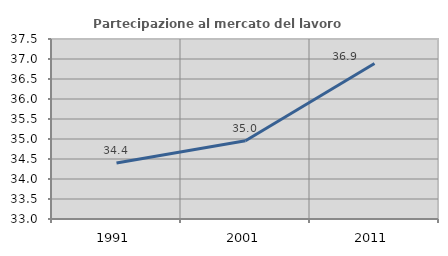
| Category | Partecipazione al mercato del lavoro  femminile |
|---|---|
| 1991.0 | 34.398 |
| 2001.0 | 34.955 |
| 2011.0 | 36.889 |